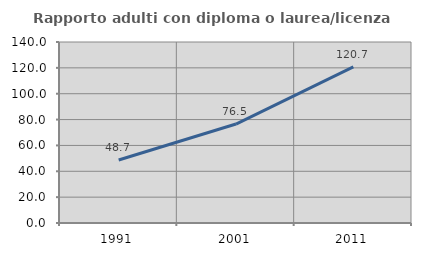
| Category | Rapporto adulti con diploma o laurea/licenza media  |
|---|---|
| 1991.0 | 48.708 |
| 2001.0 | 76.535 |
| 2011.0 | 120.69 |